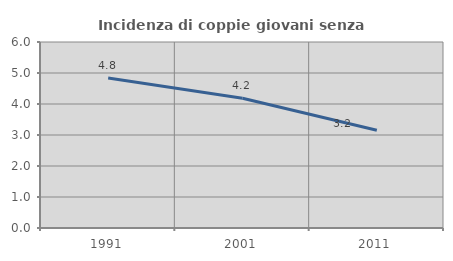
| Category | Incidenza di coppie giovani senza figli |
|---|---|
| 1991.0 | 4.839 |
| 2001.0 | 4.186 |
| 2011.0 | 3.152 |